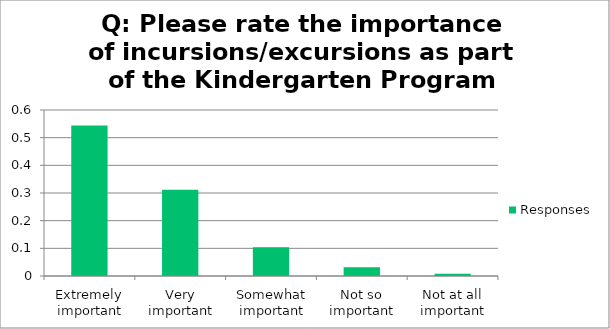
| Category | Responses |
|---|---|
| Extremely important | 0.544 |
| Very important | 0.312 |
| Somewhat important | 0.104 |
| Not so important | 0.032 |
| Not at all important | 0.008 |